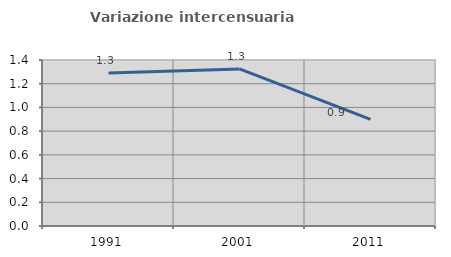
| Category | Variazione intercensuaria annua |
|---|---|
| 1991.0 | 1.29 |
| 2001.0 | 1.325 |
| 2011.0 | 0.899 |